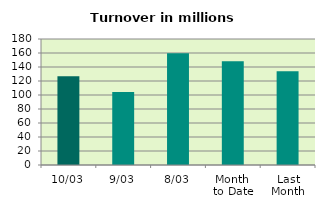
| Category | Series 0 |
|---|---|
| 10/03 | 126.913 |
| 9/03 | 104.164 |
| 8/03 | 159.52 |
| Month 
to Date | 148.275 |
| Last
Month | 133.846 |